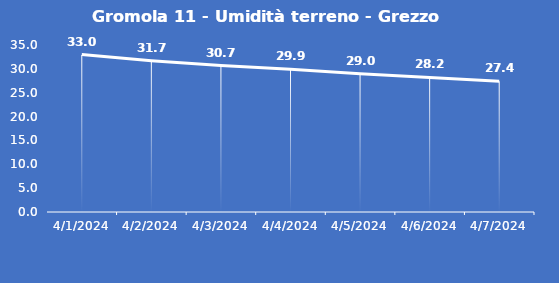
| Category | Gromola 11 - Umidità terreno - Grezzo (%VWC) |
|---|---|
| 4/1/24 | 33 |
| 4/2/24 | 31.7 |
| 4/3/24 | 30.7 |
| 4/4/24 | 29.9 |
| 4/5/24 | 29 |
| 4/6/24 | 28.2 |
| 4/7/24 | 27.4 |